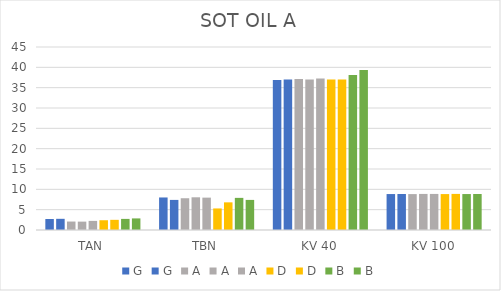
| Category | G | A | D | B |
|---|---|---|---|---|
| TAN | 2.75 | 2.24 | 2.5 | 2.85 |
| TBN | 7.4 | 7.96 | 6.8 | 7.4 |
| KV 40 | 37 | 37.255 | 37 | 39.36 |
| KV 100 | 8.86 | 8.868 | 8.876 | 8.85 |